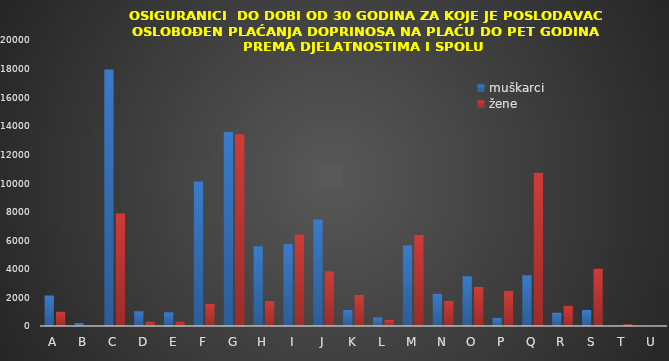
| Category | muškarci | žene |
|---|---|---|
| A | 2133 | 1001 |
| B | 208 | 25 |
| C | 17943 | 7871 |
| D | 1029 | 313 |
| E | 957 | 310 |
| F | 10112 | 1550 |
| G | 13582 | 13401 |
| H | 5571 | 1744 |
| I | 5742 | 6399 |
| J | 7448 | 3821 |
| K | 1117 | 2171 |
| L | 603 | 418 |
| M | 5635 | 6366 |
| N | 2261 | 1747 |
| O | 3480 | 2737 |
| P | 563 | 2458 |
| Q | 3543 | 10720 |
| R | 938 | 1415 |
| S | 1121 | 4019 |
| T | 22 | 124 |
| U | 11 | 14 |